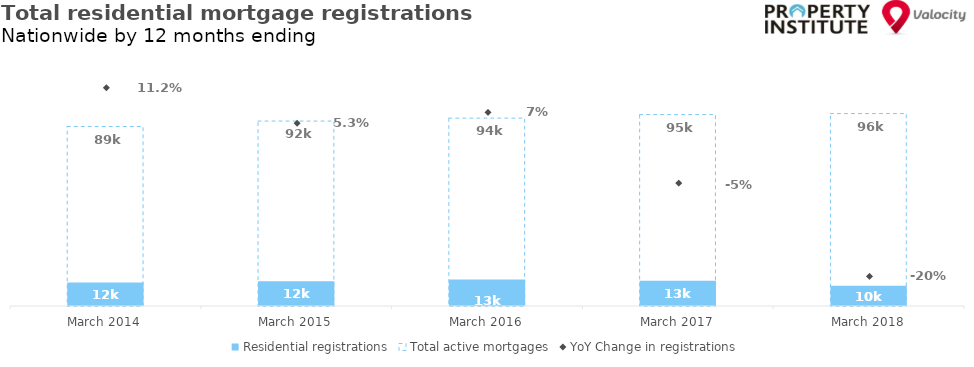
| Category | Residential registrations | Total active mortgages |
|---|---|---|
| 2014-03-01 | 11714 | 89357 |
| 2015-03-01 | 12338 | 92084 |
| 2016-03-01 | 13216 | 93549 |
| 2017-03-01 | 12607 | 95308 |
| 2018-03-01 | 10075 | 95822 |